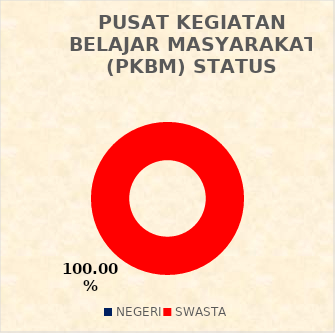
| Category | PUSAT KEGIATAN BELAJAR MASYARAKAT (PKBM) STATUS SEKOLAH |
|---|---|
| NEGERI | 0 |
| SWASTA | 28 |